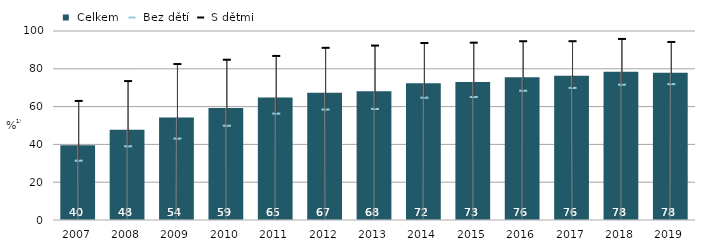
| Category |  Celkem |
|---|---|
| 2007.0 | 39.6 |
| 2008.0 | 47.7 |
| 2009.0 | 54.2 |
| 2010.0 | 59.3 |
| 2011.0 | 64.8 |
| 2012.0 | 67.285 |
| 2013.0 | 68.146 |
| 2014.0 | 72.39 |
| 2015.0 | 73.057 |
| 2016.0 | 75.571 |
| 2017.0 | 76.3 |
| 2018.0 | 78.4 |
| 2019.0 | 77.9 |